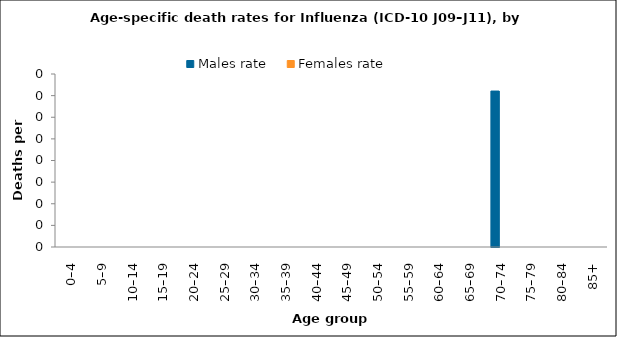
| Category | Males rate | Females rate |
|---|---|---|
| 0–4 | 0 | 0 |
| 5–9 | 0 | 0 |
| 10–14 | 0 | 0 |
| 15–19 | 0 | 0 |
| 20–24 | 0 | 0 |
| 25–29 | 0 | 0 |
| 30–34 | 0 | 0 |
| 35–39 | 0 | 0 |
| 40–44 | 0 | 0 |
| 45–49 | 0 | 0 |
| 50–54 | 0 | 0 |
| 55–59 | 0 | 0 |
| 60–64 | 0 | 0 |
| 65–69 | 0 | 0 |
| 70–74 | 0.361 | 0 |
| 75–79 | 0 | 0 |
| 80–84 | 0 | 0 |
| 85+ | 0 | 0 |